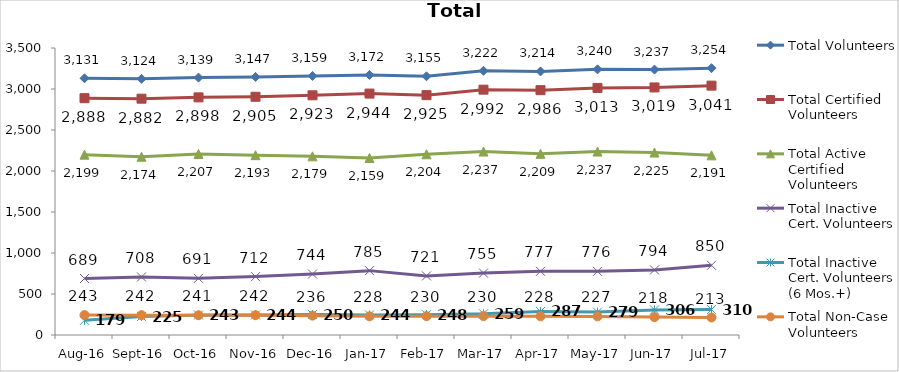
| Category | Total Volunteers | Total Certified Volunteers | Total Active Certified Volunteers | Total Inactive Cert. Volunteers | Total Inactive Cert. Volunteers (6 Mos.+) | Total Non-Case Volunteers |
|---|---|---|---|---|---|---|
| Aug-16 | 3131 | 2888 | 2199 | 689 | 179 | 243 |
| Sep-16 | 3124 | 2882 | 2174 | 708 | 225 | 242 |
| Oct-16 | 3139 | 2898 | 2207 | 691 | 243 | 241 |
| Nov-16 | 3147 | 2905 | 2193 | 712 | 244 | 242 |
| Dec-16 | 3159 | 2923 | 2179 | 744 | 250 | 236 |
| Jan-17 | 3172 | 2944 | 2159 | 785 | 244 | 228 |
| Feb-17 | 3155 | 2925 | 2204 | 721 | 248 | 230 |
| Mar-17 | 3222 | 2992 | 2237 | 755 | 259 | 230 |
| Apr-17 | 3214 | 2986 | 2209 | 777 | 287 | 228 |
| May-17 | 3240 | 3013 | 2237 | 776 | 279 | 227 |
| Jun-17 | 3237 | 3019 | 2225 | 794 | 306 | 218 |
| Jul-17 | 3254 | 3041 | 2191 | 850 | 310 | 213 |